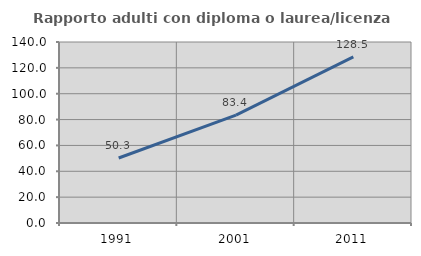
| Category | Rapporto adulti con diploma o laurea/licenza media  |
|---|---|
| 1991.0 | 50.277 |
| 2001.0 | 83.387 |
| 2011.0 | 128.484 |